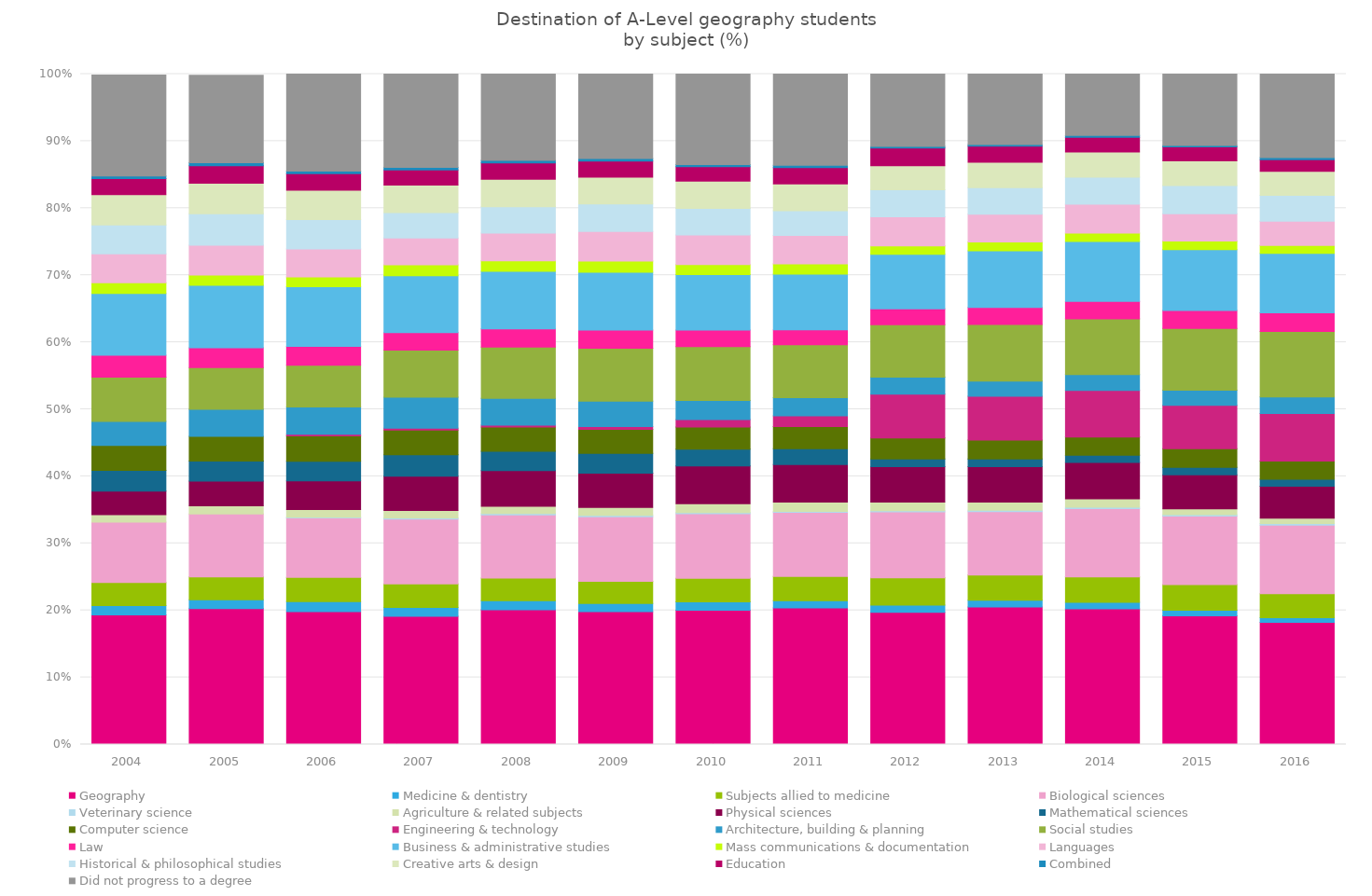
| Category | Geography | Medicine & dentistry | Subjects allied to medicine | Biological sciences | Veterinary science | Agriculture & related subjects | Physical sciences | Mathematical sciences | Computer science | Engineering & technology | Architecture, building & planning | Social studies | Law | Business & administrative studies | Mass communications & documentation | Languages | Historical & philosophical studies | Creative arts & design | Education | Combined | Did not progress to a degree |
|---|---|---|---|---|---|---|---|---|---|---|---|---|---|---|---|---|---|---|---|---|---|
| 2004.0 | 0.193 | 0.014 | 0.034 | 0.09 | 0 | 0.011 | 0.035 | 0.031 | 0.037 | 0 | 0.036 | 0.066 | 0.033 | 0.092 | 0.016 | 0.043 | 0.043 | 0.045 | 0.024 | 0.004 | 0.15 |
| 2005.0 | 0.203 | 0.013 | 0.034 | 0.094 | 0 | 0.012 | 0.037 | 0.03 | 0.037 | 0 | 0.04 | 0.062 | 0.03 | 0.093 | 0.015 | 0.044 | 0.047 | 0.045 | 0.026 | 0.004 | 0.13 |
| 2006.0 | 0.198 | 0.015 | 0.036 | 0.089 | 0.001 | 0.011 | 0.043 | 0.029 | 0.038 | 0.002 | 0.041 | 0.062 | 0.028 | 0.089 | 0.014 | 0.042 | 0.044 | 0.044 | 0.025 | 0.004 | 0.147 |
| 2007.0 | 0.191 | 0.013 | 0.035 | 0.097 | 0.002 | 0.011 | 0.051 | 0.032 | 0.037 | 0.003 | 0.046 | 0.07 | 0.026 | 0.085 | 0.016 | 0.04 | 0.038 | 0.041 | 0.023 | 0.004 | 0.141 |
| 2008.0 | 0.201 | 0.013 | 0.034 | 0.094 | 0.002 | 0.011 | 0.053 | 0.029 | 0.036 | 0.003 | 0.04 | 0.076 | 0.027 | 0.086 | 0.016 | 0.041 | 0.039 | 0.041 | 0.024 | 0.004 | 0.131 |
| 2009.0 | 0.198 | 0.012 | 0.033 | 0.096 | 0.002 | 0.012 | 0.051 | 0.03 | 0.036 | 0.004 | 0.038 | 0.079 | 0.027 | 0.086 | 0.016 | 0.044 | 0.041 | 0.04 | 0.024 | 0.004 | 0.129 |
| 2010.0 | 0.2 | 0.013 | 0.035 | 0.096 | 0.002 | 0.013 | 0.056 | 0.025 | 0.033 | 0.011 | 0.029 | 0.08 | 0.025 | 0.083 | 0.015 | 0.044 | 0.04 | 0.041 | 0.021 | 0.003 | 0.144 |
| 2011.0 | 0.204 | 0.011 | 0.036 | 0.096 | 0.001 | 0.014 | 0.056 | 0.024 | 0.033 | 0.016 | 0.027 | 0.079 | 0.022 | 0.083 | 0.015 | 0.042 | 0.037 | 0.04 | 0.024 | 0.003 | 0.149 |
| 2012.0 | 0.197 | 0.011 | 0.041 | 0.098 | 0.002 | 0.013 | 0.053 | 0.011 | 0.031 | 0.065 | 0.025 | 0.078 | 0.024 | 0.081 | 0.013 | 0.043 | 0.04 | 0.036 | 0.026 | 0.003 | 0.16 |
| 2013.0 | 0.205 | 0.01 | 0.037 | 0.095 | 0.002 | 0.012 | 0.053 | 0.012 | 0.028 | 0.066 | 0.023 | 0.085 | 0.025 | 0.085 | 0.013 | 0.041 | 0.04 | 0.038 | 0.024 | 0.003 | 0.157 |
| 2014.0 | 0.202 | 0.01 | 0.038 | 0.102 | 0.002 | 0.013 | 0.054 | 0.011 | 0.027 | 0.069 | 0.024 | 0.083 | 0.026 | 0.089 | 0.012 | 0.043 | 0.041 | 0.037 | 0.022 | 0.003 | 0.147 |
| 2015.0 | 0.192 | 0.008 | 0.038 | 0.102 | 0.002 | 0.009 | 0.051 | 0.011 | 0.028 | 0.065 | 0.023 | 0.092 | 0.027 | 0.091 | 0.013 | 0.041 | 0.042 | 0.037 | 0.021 | 0.002 | 0.158 |
| 2016.0 | 0.182 | 0.007 | 0.036 | 0.102 | 0.002 | 0.008 | 0.048 | 0.011 | 0.027 | 0.071 | 0.025 | 0.098 | 0.028 | 0.089 | 0.012 | 0.036 | 0.039 | 0.036 | 0.018 | 0.003 | 0.183 |